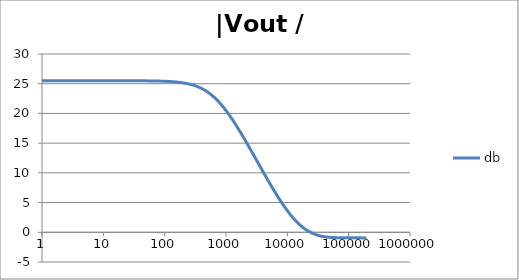
| Category | db |
|---|---|
| 1.0 | 25.503 |
| 1.0634378492473788 | 25.503 |
| 1.1309000592118907 | 25.503 |
| 1.2026419266820265 | 25.503 |
| 1.278934943925458 | 25.503 |
| 1.3600678260954062 | 25.503 |
| 1.4463476038134566 | 25.503 |
| 1.5381007850634825 | 25.503 |
| 1.6356745907936145 | 25.503 |
| 1.739438268902148 | 25.503 |
| 1.849784491579884 | 25.503 |
| 1.967130841296868 | 25.503 |
| 2.091921391056928 | 25.503 |
| 2.2246283849001642 | 25.503 |
| 2.365754025012901 | 25.503 |
| 2.5158323722080485 | 25.503 |
| 2.6754313669678584 | 25.503 |
| 2.8451549786972743 | 25.503 |
| 3.025645491321301 | 25.503 |
| 3.2175859338757533 | 25.503 |
| 3.42170266528945 | 25.503 |
| 3.6387681231394358 | 25.503 |
| 3.8696037467813236 | 25.503 |
| 4.115083085916729 | 25.503 |
| 4.376135106361553 | 25.503 |
| 4.653747705525078 | 25.503 |
| 4.948971450903514 | 25.503 |
| 5.262923555735513 | 25.503 |
| 5.596792106864742 | 25.503 |
| 5.951840560808945 | 25.503 |
| 6.329412525049976 | 25.503 |
| 6.730936842638569 | 25.503 |
| 7.157932999355504 | 25.503 |
| 7.612016873891456 | 25.503 |
| 8.094906852805886 | 25.503 |
| 8.608430333405762 | 25.503 |
| 9.154530639152917 | 25.502 |
| 9.735274373770007 | 25.502 |
| 10.352859241875105 | 25.502 |
| 11.009622365740512 | 25.502 |
| 11.708049129648925 | 25.502 |
| 12.4507825853165 | 25.502 |
| 13.240633453975693 | 25.502 |
| 14.080590762968805 | 25.501 |
| 14.973833157104059 | 25.501 |
| 15.923740927579823 | 25.501 |
| 16.93390880399795 | 25.501 |
| 18.008159557874837 | 25.5 |
| 19.150558469130036 | 25.5 |
| 20.365428710297824 | 25.499 |
| 21.65736770667993 | 25.499 |
| 23.031264534351347 | 25.498 |
| 24.492318421858034 | 25.498 |
| 26.046058425622668 | 25.497 |
| 27.698364353515743 | 25.496 |
| 29.45548901577305 | 25.495 |
| 31.32408188746347 | 25.494 |
| 33.311214272052936 | 25.493 |
| 35.42440606129053 | 25.491 |
| 37.67165419268462 | 25.49 |
| 40.06146291225952 | 25.488 |
| 42.60287595711691 | 25.486 |
| 45.30551077958928 | 25.484 |
| 48.17959494250036 | 25.481 |
| 51.23600482326248 | 25.478 |
| 54.486306773278585 | 25.475 |
| 57.94280088840825 | 25.472 |
| 61.61856755613799 | 25.467 |
| 65.52751695560372 | 25.463 |
| 69.68444169778837 | 25.457 |
| 74.10507280510043 | 25.451 |
| 78.80613924217637 | 25.445 |
| 83.8054312231895 | 25.437 |
| 89.12186753523771 | 25.429 |
| 94.77556713258299 | 25.419 |
| 100.78792527267464 | 25.408 |
| 107.18169448207877 | 25.396 |
| 113.98107065871142 | 25.382 |
| 121.21178463621371 | 25.366 |
| 128.90119955697148 | 25.348 |
| 137.07841442227294 | 25.329 |
| 145.77437421146283 | 25.306 |
| 155.02198698682062 | 25.281 |
| 164.85624842731968 | 25.253 |
| 175.3143742625403 | 25.221 |
| 186.43594110790573 | 25.185 |
| 198.26303623420247 | 25.146 |
| 210.84041683815525 | 25.101 |
| 224.21567941678887 | 25.051 |
| 238.43943988652958 | 24.995 |
| 253.56552512868072 | 24.933 |
| 269.65117668612646 | 24.863 |
| 286.75726738211927 | 24.786 |
| 304.9485316808965 | 24.7 |
| 324.2938106618788 | 24.606 |
| 344.8663125345048 | 24.501 |
| 366.7438896795682 | 24.385 |
| 390.00933326545766 | 24.258 |
| 414.7506865542229 | 24.119 |
| 441.06157808309626 | 23.966 |
| 469.0415759823428 | 23.8 |
| 498.7965647702637 | 23.62 |
| 530.4391460512702 | 23.424 |
| 564.089064633379 | 23.214 |
| 599.8736616776864 | 22.987 |
| 637.9283565946681 | 22.745 |
| 678.3971595109495 | 22.486 |
| 721.4332162458546 | 22.21 |
| 767.1993878601115 | 21.919 |
| 815.868866969862 | 21.612 |
| 867.6258331583267 | 21.289 |
| 922.6661499653554 | 20.95 |
| 981.1981060925172 | 20.597 |
| 1043.443203628628 | 20.23 |
| 1109.6369962786232 | 19.85 |
| 1180.0299807678607 | 19.457 |
| 1254.8885447951977 | 19.052 |
| 1334.4959751221782 | 18.636 |
| 1419.1535296132129 | 18.21 |
| 1509.1815772837017 | 17.775 |
| 1604.9208106703452 | 17.331 |
| 1706.7335351116335 | 16.879 |
| 1815.0050398174897 | 16.42 |
| 1930.1450559166665 | 15.956 |
| 2052.58930699948 | 15.486 |
| 2182.801158023697 | 15.011 |
| 2321.2733688234066 | 14.532 |
| 2468.5299588567814 | 14.05 |
| 2625.128190249376 | 13.566 |
| 2791.6606766374607 | 13.079 |
| 2968.757625791824 | 12.591 |
| 3157.08922450881 | 12.102 |
| 3357.3681747937244 | 11.613 |
| 3570.352390934236 | 11.125 |
| 3796.8478676703417 | 10.637 |
| 4037.7117303148448 | 10.151 |
| 4293.8554783669315 | 9.668 |
| 4566.248434893605 | 9.187 |
| 4855.9214147324665 | 8.71 |
| 5163.970625397384 | 8.237 |
| 5491.561815449236 | 7.769 |
| 5839.934686030357 | 7.307 |
| 6210.40758225729 | 6.852 |
| 6604.382482225307 | 6.403 |
| 7023.350302504747 | 5.963 |
| 7468.896540206577 | 5.532 |
| 7942.707272968458 | 5.111 |
| 8446.575539567106 | 4.7 |
| 8982.408125302747 | 4.301 |
| 9552.232777834151 | 3.914 |
| 10158.205880770249 | 3.54 |
| 10802.620614058389 | 3.181 |
| 11487.915632049675 | 2.836 |
| 12216.684292082227 | 2.507 |
| 12991.684468506162 | 2.193 |
| 13815.848989288772 | 1.896 |
| 14692.296734695852 | 1.616 |
| 15624.344440049217 | 1.352 |
| 16615.519247226184 | 1.106 |
| 17669.572052398642 | 0.877 |
| 18790.49170052441 | 0.665 |
| 19982.5200803064 | 0.469 |
| 21250.168176743602 | 0.29 |
| 22598.233142021272 | 0.127 |
| 24031.816449341983 | -0.02 |
| 25556.34319839602 | -0.153 |
| 27177.582645530147 | -0.272 |
| 28901.67003630542 | -0.378 |
| 30735.129823066054 | -0.47 |
| 32684.900355380338 | -0.552 |
| 34758.3601367905 | -0.622 |
| 36963.35574723439 | -0.682 |
| 39308.23153680468 | -0.733 |
| 41801.861203217486 | -0.775 |
| 44453.68137248706 | -0.81 |
| 47273.727309885995 | -0.838 |
| 50272.670896332245 | -0.86 |
| 53461.86101391677 | -0.877 |
| 56853.36649340195 | -0.889 |
| 60460.02178621637 | -0.898 |
| 64295.47553378361 | -0.904 |
| 68374.24221798431 | -0.907 |
| 72711.75708821259 | -0.909 |
| 77324.43457288652 | -0.909 |
| 82229.73039646025 | -0.908 |
| 87446.2076370035 | -0.906 |
| 92993.60697433475 | -0.905 |
| 98892.92139454243 | -0.904 |
| 105166.47563360249 | -0.904 |
| 111838.01066072512 | -0.904 |
| 118932.77352114675 | -0.905 |
| 126477.61287835392 | -0.908 |
| 134501.0806172993 | -0.913 |
| 143033.53989310883 | -0.919 |
| 152107.28003416685 | -0.927 |
| 161756.63873440344 | -0.938 |
| 172018.1319971993 | -0.951 |
| 182930.592322653 | -0.966 |
| 194535.31566115122 | -0.985 |